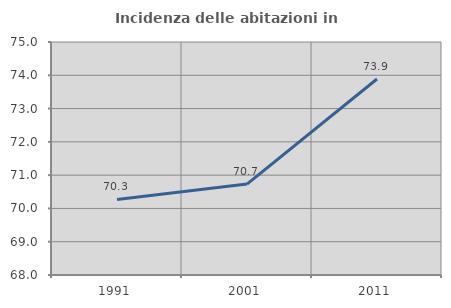
| Category | Incidenza delle abitazioni in proprietà  |
|---|---|
| 1991.0 | 70.27 |
| 2001.0 | 70.732 |
| 2011.0 | 73.889 |